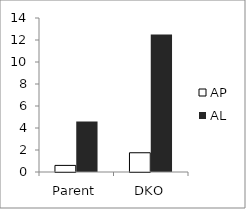
| Category | AP | AL |
|---|---|---|
| Parent | 0.6 | 4.6 |
| DKO | 1.75 | 12.5 |